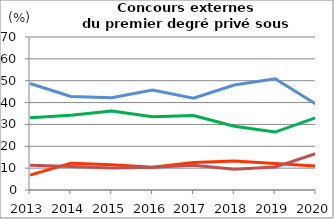
| Category | Étudiants | Enseignants et personnels d'éducation et de surveillance                            | Autres emplois dans secteurs public ou privé                | Sans emploi                    |
|---|---|---|---|---|
| 2013.0 | 48.736 | 33.103 | 6.782 | 11.379 |
| 2014.0 | 42.794 | 34.148 | 12.281 | 10.777 |
| 2015.0 | 42.2 | 36.1 | 11.6 | 10.1 |
| 2016.0 | 45.7 | 33.5 | 10.4 | 10.4 |
| 2017.0 | 42 | 34.1 | 12.6 | 11.3 |
| 2018.0 | 48 | 29.2 | 13.3 | 9.5 |
| 2019.0 | 50.9 | 26.5 | 12.1 | 10.5 |
| 2020.0 | 39.3 | 33.1 | 10.9 | 16.7 |